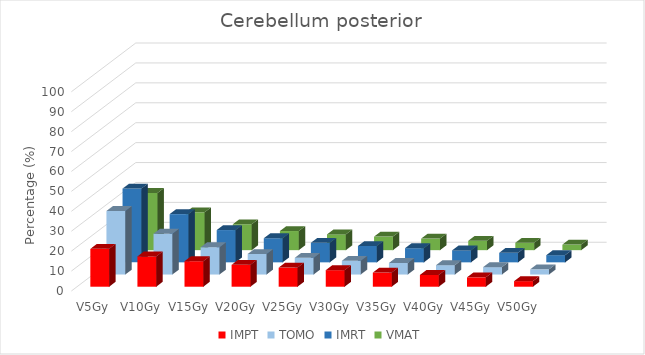
| Category | IMPT | TOMO | IMRT | VMAT |
|---|---|---|---|---|
| V5Gy | 19 | 31.9 | 37 | 28.7 |
| V10Gy | 15.2 | 20.5 | 24.2 | 19 |
| V15Gy | 12.8 | 13.7 | 16.2 | 13 |
| V20Gy | 11 | 10.3 | 12.1 | 9.6 |
| V25Gy | 9.6 | 8.4 | 9.8 | 7.9 |
| V30Gy | 8.3 | 6.9 | 8.2 | 6.8 |
| V35Gy | 7.1 | 5.8 | 7.1 | 5.8 |
| V40Gy | 5.9 | 4.7 | 6 | 4.7 |
| V45Gy | 4.7 | 3.7 | 4.8 | 3.7 |
| V50Gy | 2.8 | 2.6 | 3.6 | 2.8 |